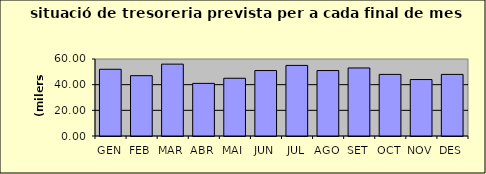
| Category | Series 0 |
|---|---|
| GEN | 52 |
| FEB | 47 |
| MAR | 56 |
| ABR | 41 |
| MAI | 45 |
| JUN | 51 |
| JUL | 55 |
| AGO | 51 |
| SET | 53 |
| OCT | 48 |
| NOV | 44 |
| DES | 48 |